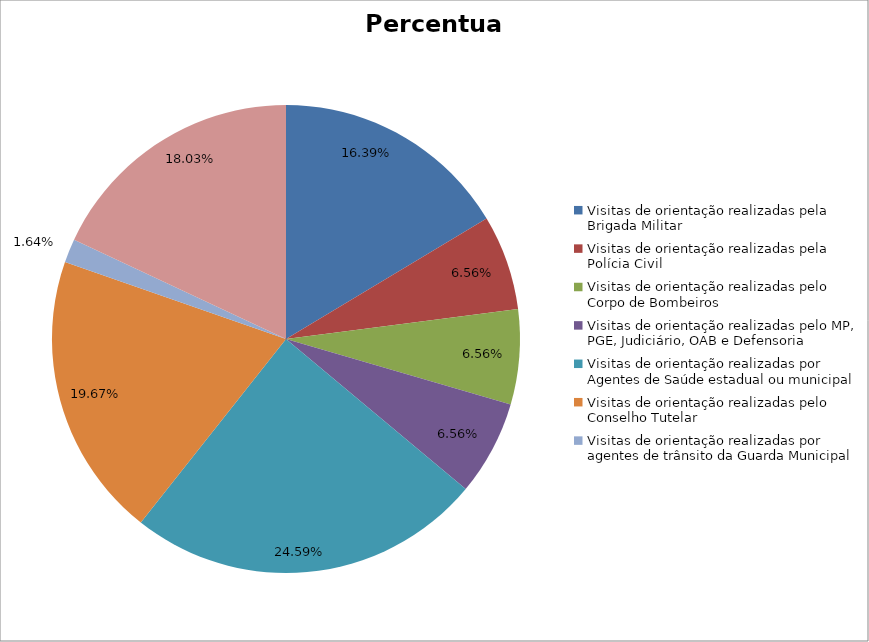
| Category | Percentual |
|---|---|
| Visitas de orientação realizadas pela Brigada Militar | 0.164 |
| Visitas de orientação realizadas pela Polícia Civil | 0.066 |
| Visitas de orientação realizadas pelo Corpo de Bombeiros | 0.066 |
| Visitas de orientação realizadas pelo MP, PGE, Judiciário, OAB e Defensoria | 0.066 |
| Visitas de orientação realizadas por Agentes de Saúde estadual ou municipal | 0.246 |
| Visitas de orientação realizadas pelo Conselho Tutelar | 0.197 |
| Visitas de orientação realizadas por agentes de trânsito da Guarda Municipal | 0.016 |
| Visitas de orientação realizadas por ONGs, entidades privadas, CRAS e CREAS | 0.18 |